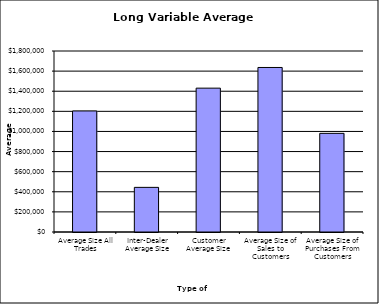
| Category | Security Type |
|---|---|
| Average Size All Trades | 1203789.735 |
| Inter-Dealer Average Size | 443811.239 |
| Customer Average Size | 1430541.702 |
| Average Size of Sales to Customers | 1636156.015 |
| Average Size of Purchases From Customers | 981006.849 |